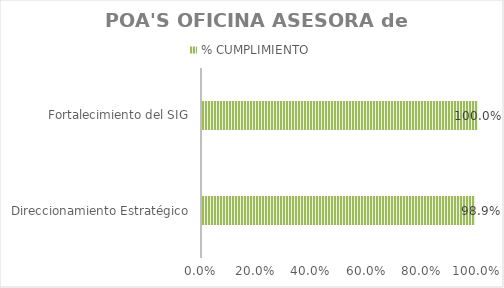
| Category | % CUMPLIMIENTO |
|---|---|
| Direccionamiento Estratégico | 0.989 |
| Fortalecimiento del SIG | 1 |